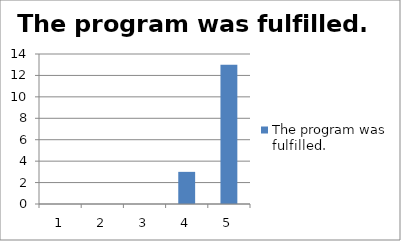
| Category | The program was fulfilled. |
|---|---|
| 0 | 0 |
| 1 | 0 |
| 2 | 0 |
| 3 | 3 |
| 4 | 13 |